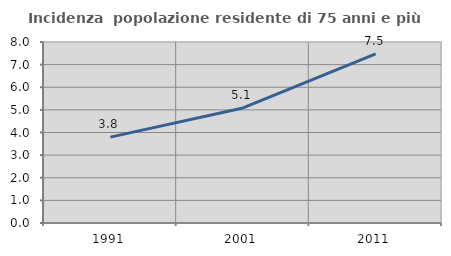
| Category | Incidenza  popolazione residente di 75 anni e più |
|---|---|
| 1991.0 | 3.794 |
| 2001.0 | 5.086 |
| 2011.0 | 7.476 |